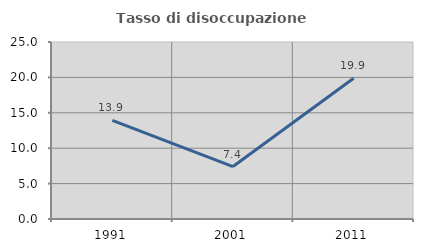
| Category | Tasso di disoccupazione giovanile  |
|---|---|
| 1991.0 | 13.94 |
| 2001.0 | 7.407 |
| 2011.0 | 19.87 |